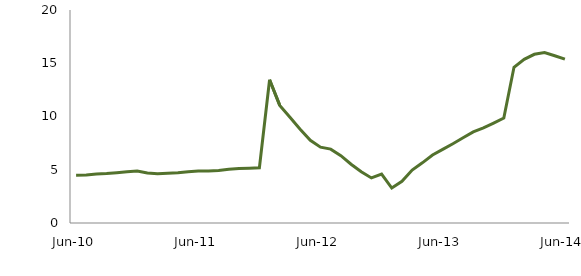
| Category | Series 0 |
|---|---|
| Jun-10 | 4.494 |
|  | 4.502 |
|  | 4.592 |
|  | 4.639 |
|  | 4.726 |
|  | 4.816 |
|  | 4.886 |
|  | 4.703 |
|  | 4.632 |
|  | 4.674 |
|  | 4.715 |
|  | 4.818 |
| Jun-11 | 4.876 |
|  | 4.891 |
|  | 4.923 |
|  | 5.055 |
|  | 5.115 |
|  | 5.14 |
|  | 5.184 |
|  | 13.448 |
|  | 11.044 |
|  | 9.928 |
|  | 8.811 |
|  | 7.762 |
| Jun-12 | 7.121 |
|  | 6.936 |
|  | 6.325 |
|  | 5.519 |
|  | 4.806 |
|  | 4.231 |
|  | 4.589 |
|  | 3.285 |
|  | 3.908 |
|  | 4.967 |
|  | 5.65 |
|  | 6.385 |
| Jun-13 | 6.913 |
|  | 7.445 |
|  | 8.003 |
|  | 8.554 |
|  | 8.933 |
|  | 9.386 |
|  | 9.861 |
|  | 14.619 |
|  | 15.361 |
|  | 15.84 |
|  | 15.998 |
|  | 15.703 |
| Jun-14 | 15.38 |